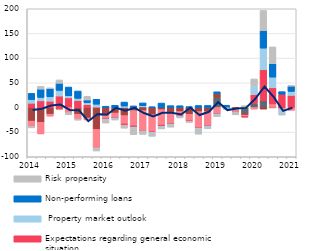
| Category | Other factors | Costs of funding | Competition from other banks | Expectations regarding general economic situation |  Property market outlook | Non-performing loans  | Risk propensity |
|---|---|---|---|---|---|---|---|
| 2014.0 | 0.064 | -27.614 | -10.883 | 8.513 | 7.366 | 12.572 | -2.931 |
| nan | 0 | -30.154 | -23.565 | 13.381 | 6.958 | 16.79 | 5.591 |
| nan | 0 | -13.58 | -4.04 | 12.84 | 8.698 | 16.68 | 1.322 |
| nan | 0 | -3.194 | -0.943 | 23.215 | 11.346 | 14.413 | 6.815 |
| 2015.0 | 0 | 1.584 | -10.634 | 17.798 | 4.391 | 17.665 | -4.309 |
| nan | 0 | -13.709 | -9.748 | 14.011 | 4.433 | 14.906 | -2.291 |
| nan | 0 | -21.32 | -4.036 | 5.521 | 4.364 | 5.262 | 7.435 |
| nan | 0 | -44.371 | -37.787 | 0.672 | 5.886 | 9.984 | -6.068 |
| 2016.0 | 0 | -13.683 | -9.865 | -0.183 | -2.017 | 2.537 | -5.896 |
| nan | 0 | -11.339 | -9.602 | -0.197 | -1.974 | 4.34 | -2.332 |
| nan | 0 | -16.54 | -16.708 | -2.652 | 2.885 | 8.061 | -6.073 |
| nan | 0 | -6.439 | -30.804 | -2.596 | -1.957 | 3.101 | -13.396 |
| 2017.0 | 1.137 | -6.563 | -40.484 | -0.096 | 2.394 | 5.669 | -7.434 |
| nan | 0 | -14.708 | -34.121 | -1.211 | -2.234 | 1.309 | -6.144 |
| nan | 0 | -4.365 | -31.359 | -2.483 | -2.033 | 8.902 | -3.307 |
| nan | 0 | -9.63 | -23.589 | -0.294 | -2.083 | 3.686 | -4.267 |
| 2018.0 | 0 | -8.401 | -9.465 | -0.308 | -2.087 | 3.545 | -0.758 |
| nan | 0 | -13.817 | -13.719 | -0.384 | -1.143 | 1.627 | -1.188 |
| nan | 0 | -8.391 | -32.723 | -0.405 | -2.001 | 3.96 | -10.656 |
| nan | 0 | -8.386 | -28.581 | -0.415 | -2.043 | 4.097 | -3.682 |
| 2019.0 | 19.953 | 7.614 | -12.529 | -0.41 | -2.062 | 4.174 | -3.764 |
| nan | 0 | -0.003 | 0 | -0.494 | 0 | 4.55 | -3.594 |
| nan | 0 | -3.529 | -4.583 | -0.546 | 0 | 0 | -6.275 |
| nan | -12.056 | -3.387 | -3.387 | -0.556 | 0 | 0 | 3.746 |
| 2020.0 | 8.2 | 0 | -3.3 | 17.776 | 18.324 | 0 | 13.5 |
| nan | 13.5 | -3.3 | 0 | 63.053 | 43.711 | 35.524 | 40.8 |
| nan | -0.7 | 0 | 7.2 | 32.599 | 21.695 | 27.071 | 34.2 |
| nan | -0.411 | -0.778 | -3.063 | 26.746 | -8.12 | 5.298 | -3.047 |
| 2021.0 | -0.834 | 0 | -5.032 | 24.468 | 7.975 | 11.008 | 0.658 |